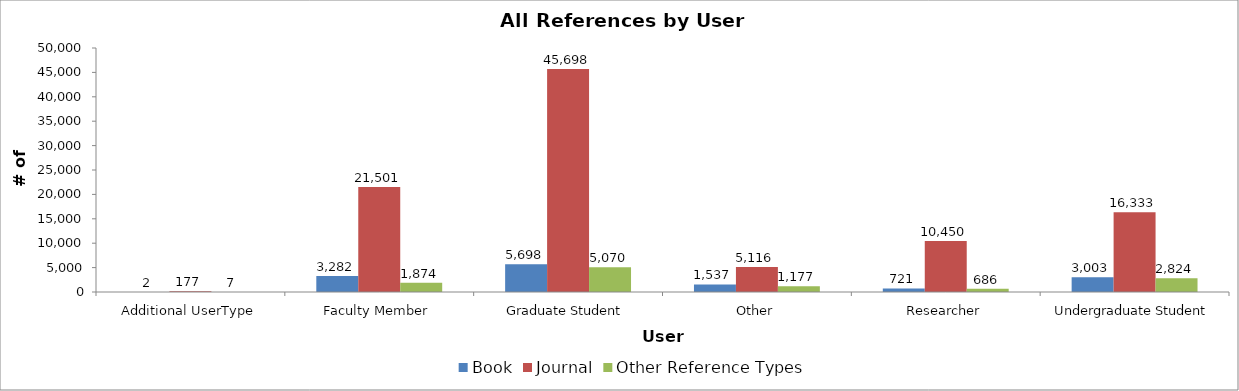
| Category | Book | Journal | Other Reference Types |
|---|---|---|---|
| Additional UserType | 2 | 177 | 7 |
| Faculty Member | 3282 | 21501 | 1874 |
| Graduate Student | 5698 | 45698 | 5070 |
| Other | 1537 | 5116 | 1177 |
| Researcher | 721 | 10450 | 686 |
| Undergraduate Student | 3003 | 16333 | 2824 |